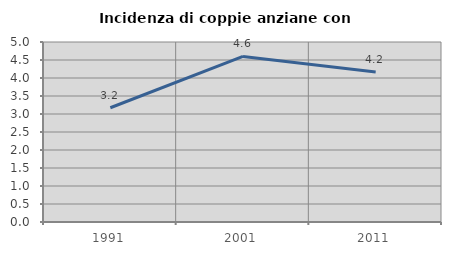
| Category | Incidenza di coppie anziane con figli |
|---|---|
| 1991.0 | 3.174 |
| 2001.0 | 4.6 |
| 2011.0 | 4.164 |